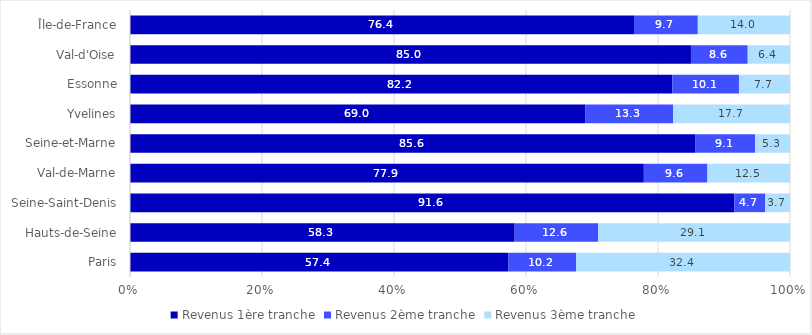
| Category | Revenus |
|---|---|
| Paris | 32.424 |
| Hauts-de-Seine | 29.086 |
| Seine-Saint-Denis | 3.739 |
| Val-de-Marne | 12.507 |
| Seine-et-Marne | 5.285 |
| Yvelines | 17.7 |
| Essonne | 7.732 |
| Val-d'Oise | 6.407 |
| Île-de-France | 13.965 |